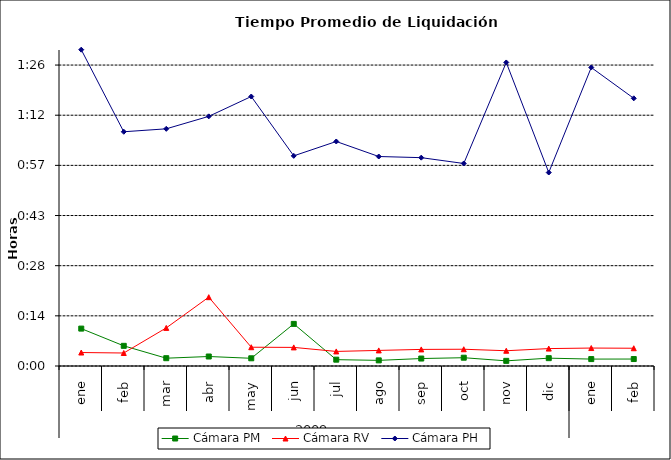
| Category | Cámara PM | Cámara RV | Cámara PH |
|---|---|---|---|
| 0 | 0.007 | 0.003 | 0.063 |
| 1 | 0.004 | 0.003 | 0.047 |
| 2 | 0.002 | 0.008 | 0.047 |
| 3 | 0.002 | 0.014 | 0.05 |
| 4 | 0.002 | 0.004 | 0.054 |
| 5 | 0.008 | 0.004 | 0.042 |
| 6 | 0.001 | 0.003 | 0.045 |
| 7 | 0.001 | 0.003 | 0.042 |
| 8 | 0.001 | 0.003 | 0.042 |
| 9 | 0.002 | 0.003 | 0.04 |
| 10 | 0.001 | 0.003 | 0.061 |
| 11 | 0.002 | 0.003 | 0.039 |
| 12 | 0.001 | 0.004 | 0.06 |
| 13 | 0.001 | 0.004 | 0.053 |